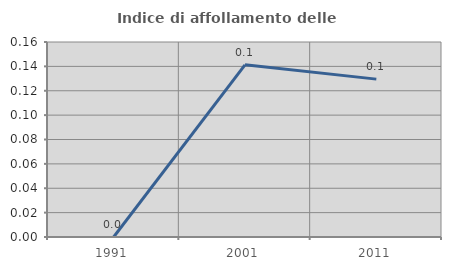
| Category | Indice di affollamento delle abitazioni  |
|---|---|
| 1991.0 | 0 |
| 2001.0 | 0.141 |
| 2011.0 | 0.13 |